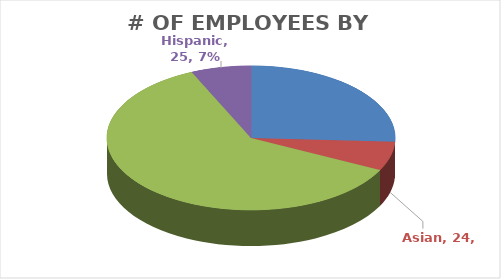
| Category | # |
|---|---|
| African-Am | 96 |
| Asian | 24 |
| Caucasian | 226 |
| Hispanic | 25 |